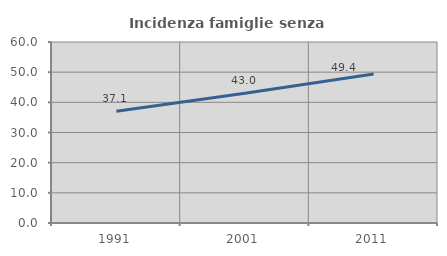
| Category | Incidenza famiglie senza nuclei |
|---|---|
| 1991.0 | 37.054 |
| 2001.0 | 42.975 |
| 2011.0 | 49.378 |